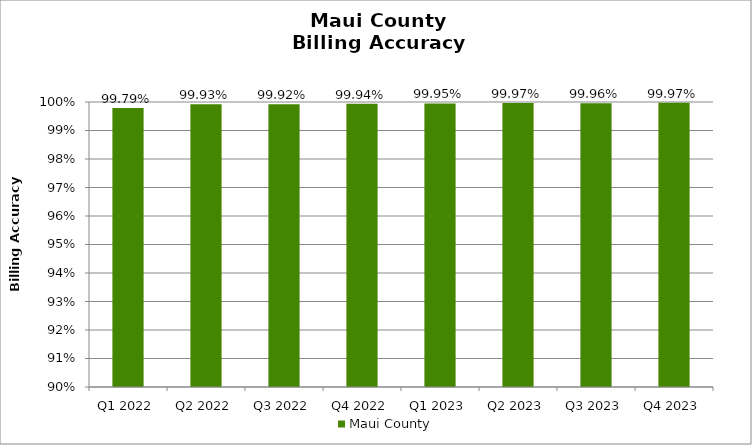
| Category | Maui County |
|---|---|
| Q1 2022 | 0.998 |
| Q2 2022 | 0.999 |
| Q3 2022 | 0.999 |
| Q4 2022 | 0.999 |
| Q1 2023 | 0.999 |
| Q2 2023 | 1 |
| Q3 2023 | 1 |
| Q4 2023 | 1 |